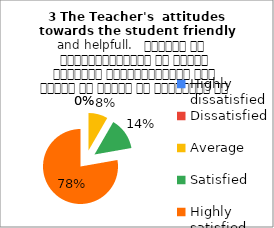
| Category | 3 The Teacher's  attitudes towards the student friendly and helpfull.   शिक्षक का विद्यार्थियों के प्रति व्यवहार मित्रतापूर्ण एवम सहयोग के भावना से परिपूर्ण था |
|---|---|
| Highly dissatisfied | 0 |
| Dissatisfied | 0 |
| Average | 3 |
| Satisfied | 5 |
| Highly satisfied | 28 |